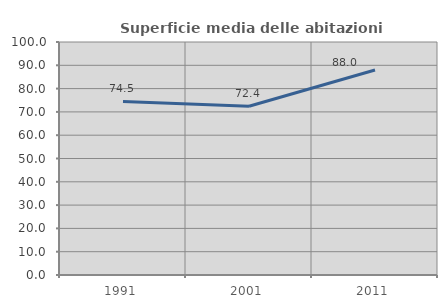
| Category | Superficie media delle abitazioni occupate |
|---|---|
| 1991.0 | 74.481 |
| 2001.0 | 72.408 |
| 2011.0 | 87.964 |